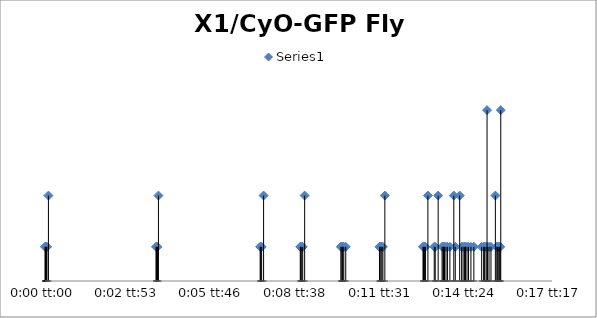
| Category | Series 0 |
|---|---|
| 0.0 | 2 |
| 1.157407407408051e-05 | 2 |
| 3.472222222222765e-05 | 2 |
| 4.629629629629428e-05 | 2 |
| 8.101851851852193e-05 | 5 |
| 0.0026273148148148184 | 2 |
| 0.002638888888888899 | 2 |
| 0.002662037037037032 | 2 |
| 0.0026851851851851793 | 5 |
| 0.005092592592592593 | 2 |
| 0.0051041666666666735 | 2 |
| 0.005127314814814807 | 2 |
| 0.005173611111111115 | 5 |
| 0.006041666666666667 | 2 |
| 0.006053240740740748 | 2 |
| 0.006076388888888881 | 2 |
| 0.006099537037037028 | 2 |
| 0.0061458333333333365 | 5 |
| 0.007002314814814822 | 2 |
| 0.007025462962962956 | 2 |
| 0.007037037037037036 | 2 |
| 0.007048611111111103 | 2 |
| 0.007071759259259264 | 2 |
| 0.007118055555555558 | 2 |
| 0.007916666666666669 | 2 |
| 0.00792824074074075 | 2 |
| 0.007951388888888883 | 2 |
| 0.00797453703703703 | 2 |
| 0.007997685185185177 | 2 |
| 0.008043981481481485 | 5 |
| 0.008946759259259252 | 2 |
| 0.008958333333333332 | 2 |
| 0.00898148148148148 | 2 |
| 0.00900462962962964 | 2 |
| 0.009062500000000001 | 5 |
| 0.009212962962962964 | 2 |
| 0.009236111111111112 | 2 |
| 0.009305555555555553 | 5 |
| 0.009398148148148142 | 2 |
| 0.009421296296296289 | 2 |
| 0.00943287037037037 | 2 |
| 0.009456018518518516 | 2 |
| 0.009490740740740744 | 2 |
| 0.009525462962962958 | 2 |
| 0.009583333333333333 | 2 |
| 0.009675925925925921 | 5 |
| 0.009710648148148149 | 2 |
| 0.009814814814814818 | 5 |
| 0.009861111111111098 | 2 |
| 0.009895833333333326 | 2 |
| 0.009930555555555554 | 2 |
| 0.009953703703703715 | 2 |
| 0.009988425925925914 | 2 |
| 0.010023148148148142 | 2 |
| 0.010081018518518503 | 2 |
| 0.010150462962962958 | 2 |
| 0.010335648148148135 | 2 |
| 0.010381944444444444 | 2 |
| 0.01040509259259259 | 2 |
| 0.010439814814814818 | 2 |
| 0.01046296296296298 | 10 |
| 0.010474537037037032 | 2 |
| 0.01050925925925926 | 2 |
| 0.010555555555555568 | 2 |
| 0.010659722222222223 | 5 |
| 0.010694444444444437 | 2 |
| 0.010706018518518517 | 2 |
| 0.010740740740740745 | 2 |
| 0.010752314814814812 | 2 |
| 0.010775462962962973 | 2 |
| 0.010787037037037026 | 10 |